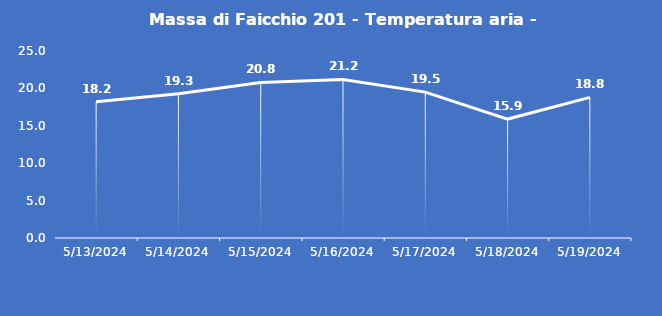
| Category | Massa di Faicchio 201 - Temperatura aria - Grezzo (°C) |
|---|---|
| 5/13/24 | 18.2 |
| 5/14/24 | 19.3 |
| 5/15/24 | 20.8 |
| 5/16/24 | 21.2 |
| 5/17/24 | 19.5 |
| 5/18/24 | 15.9 |
| 5/19/24 | 18.8 |